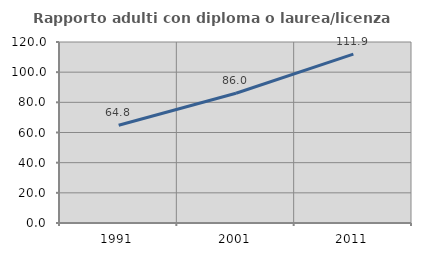
| Category | Rapporto adulti con diploma o laurea/licenza media  |
|---|---|
| 1991.0 | 64.789 |
| 2001.0 | 86.034 |
| 2011.0 | 111.936 |